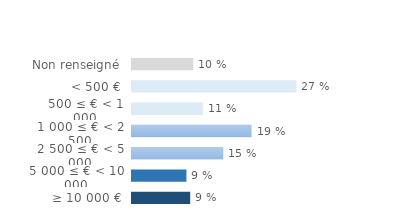
| Category | Series 0 |
|---|---|
| Non renseigné | 0.099 |
| < 500 € | 0.265 |
| 500 ≤ € < 1 000 | 0.114 |
| 1 000 ≤ € < 2 500 | 0.193 |
| 2 500 ≤ € < 5 000 | 0.147 |
| 5 000 ≤ € < 10 000 | 0.088 |
| ≥ 10 000 € | 0.094 |